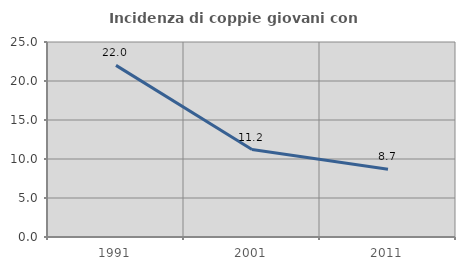
| Category | Incidenza di coppie giovani con figli |
|---|---|
| 1991.0 | 22 |
| 2001.0 | 11.214 |
| 2011.0 | 8.699 |